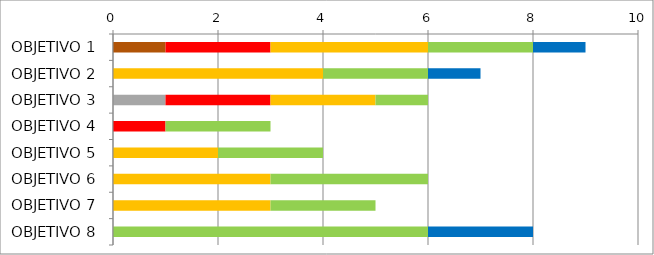
| Category | Series 0 | Series 1 | Series 2 | Series 3 | Series 4 | Series 5 |
|---|---|---|---|---|---|---|
| OBJETIVO 1 | 1 | 0 | 2 | 3 | 2 | 1 |
| OBJETIVO 2 | 0 | 0 | 0 | 4 | 2 | 1 |
| OBJETIVO 3 | 0 | 1 | 2 | 2 | 1 | 0 |
| OBJETIVO 4 | 0 | 0 | 1 | 0 | 2 | 0 |
| OBJETIVO 5 | 0 | 0 | 0 | 2 | 2 | 0 |
| OBJETIVO 6 | 0 | 0 | 0 | 3 | 3 | 0 |
| OBJETIVO 7 | 0 | 0 | 0 | 3 | 2 | 0 |
| OBJETIVO 8 | 0 | 0 | 0 | 0 | 6 | 2 |